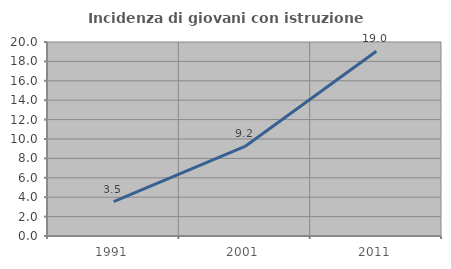
| Category | Incidenza di giovani con istruzione universitaria |
|---|---|
| 1991.0 | 3.54 |
| 2001.0 | 9.231 |
| 2011.0 | 19.048 |